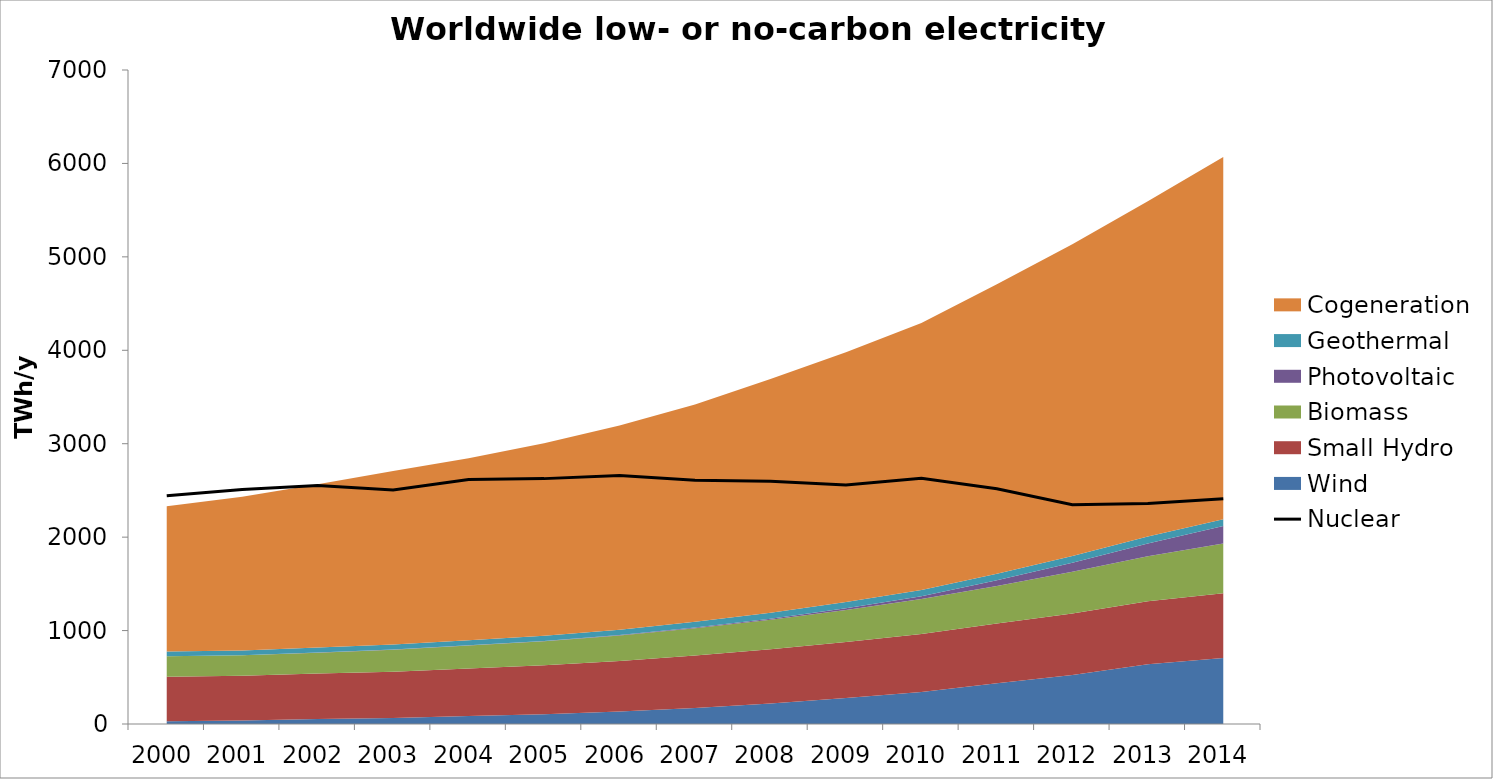
| Category | Nuclear  |
|---|---|
| 0 | 2443.85 |
| 1 | 2511.09 |
| 2 | 2553.18 |
| 3 | 2504.78 |
| 4 | 2616.24 |
| 5 | 2626.34 |
| 6 | 2660.85 |
| 7 | 2608.18 |
| 8 | 2597.81 |
| 9 | 2558.06 |
| 10 | 2629.82 |
| 11 | 2517.98 |
| 12 | 2346.19 |
| 13 | 2358.86 |
| 14 | 2410.37 |